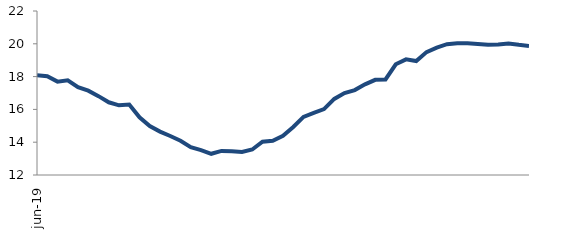
| Category | Series 0 |
|---|---|
| 2019-06-01 | 18.089 |
| 2019-07-01 | 18.02 |
| 2019-08-01 | 17.694 |
| 2019-09-01 | 17.777 |
| 2019-10-01 | 17.36 |
| 2019-11-01 | 17.14 |
| 2019-12-01 | 16.808 |
| 2020-01-01 | 16.434 |
| 2020-02-01 | 16.25 |
| 2020-03-01 | 16.293 |
| 2020-04-01 | 15.517 |
| 2020-05-01 | 14.987 |
| 2020-06-01 | 14.648 |
| 2020-07-01 | 14.379 |
| 2020-08-01 | 14.088 |
| 2020-09-01 | 13.698 |
| 2020-10-01 | 13.522 |
| 2020-11-01 | 13.294 |
| 2020-12-01 | 13.469 |
| 2021-01-01 | 13.453 |
| 2021-02-01 | 13.409 |
| 2021-03-01 | 13.556 |
| 2021-04-01 | 14.027 |
| 2021-05-01 | 14.092 |
| 2021-06-01 | 14.388 |
| 2021-07-01 | 14.927 |
| 2021-08-01 | 15.546 |
| 2021-09-01 | 15.791 |
| 2021-10-01 | 16.017 |
| 2021-11-01 | 16.641 |
| 2021-12-01 | 16.998 |
| 2022-01-01 | 17.179 |
| 2022-02-01 | 17.527 |
| 2022-03-01 | 17.804 |
| 2022-04-01 | 17.825 |
| 2022-05-01 | 18.751 |
| 2022-06-01 | 19.052 |
| 2022-07-01 | 18.945 |
| 2022-08-01 | 19.494 |
| 2022-09-01 | 19.767 |
| 2022-10-01 | 19.975 |
| 2022-11-01 | 20.037 |
| 2022-12-01 | 20.03 |
| 2023-01-01 | 19.993 |
| 2023-02-01 | 19.949 |
| 2023-03-01 | 19.953 |
| 2023-04-01 | 20.023 |
| 2023-05-01 | 19.94 |
| 2023-06-01 | 19.871 |